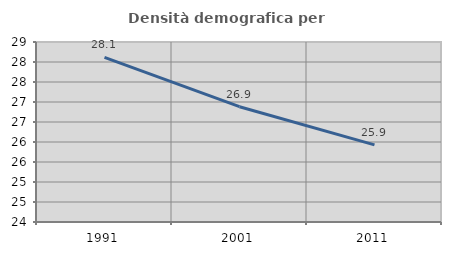
| Category | Densità demografica |
|---|---|
| 1991.0 | 28.116 |
| 2001.0 | 26.882 |
| 2011.0 | 25.929 |